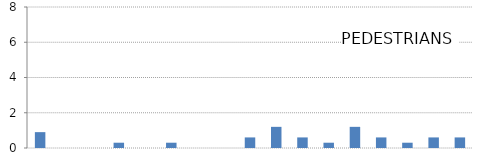
| Category | PEDESTRIANS |
|---|---|
| 0-4  | 0.9 |
| 5-9 | 0 |
| 10-14 | 0 |
| 15-19  | 0.3 |
| 20-24  | 0 |
| 25-29  | 0.3 |
| 30-34  | 0 |
| 35-39  | 0 |
| 40-44  | 0.6 |
| 45-49  | 1.2 |
| 50-54  | 0.6 |
| 55-59  | 0.3 |
| 60-64  | 1.2 |
| 65-69  | 0.6 |
| 70-74  | 0.3 |
| 75-79  | 0.6 |
| 80+ | 0.6 |